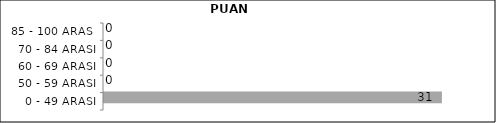
| Category | Series 0 | Series 1 | Series 2 |
|---|---|---|---|
| 0 - 49 ARASI |  |  | 31 |
| 50 - 59 ARASI |  |  | 0 |
| 60 - 69 ARASI |  |  | 0 |
| 70 - 84 ARASI |  |  | 0 |
| 85 - 100 ARASI |  |  | 0 |